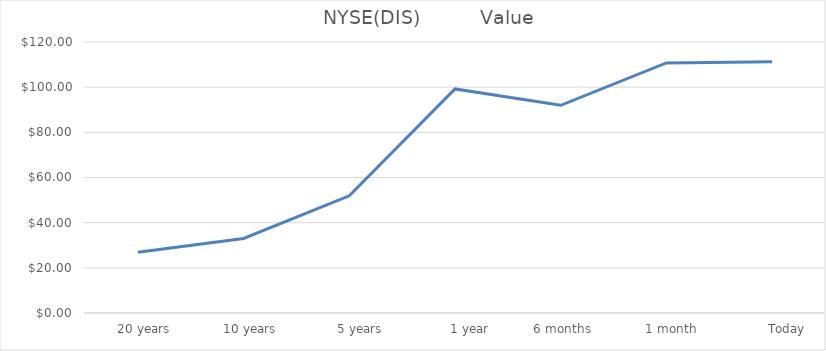
| Category | NYSE(DIS) |
|---|---|
|     20 years | 26.94 |
|     10 years | 33 |
|       5 years | 51.9 |
|         1 year | 99.2 |
|   6 months | 91.96 |
|    1 month | 110.71 |
|         Today | 111.21 |